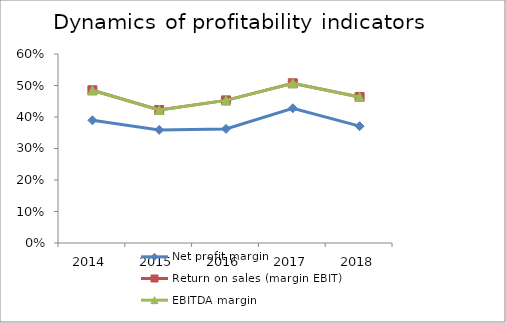
| Category | Net profit margin | Return on sales (margin EBIT) | EBITDA margin |
|---|---|---|---|
| 2014.0 | 0.39 | 0.485 | 0.485 |
| 2015.0 | 0.359 | 0.422 | 0.422 |
| 2016.0 | 0.362 | 0.453 | 0.453 |
| 2017.0 | 0.428 | 0.507 | 0.507 |
| 2018.0 | 0.371 | 0.464 | 0.464 |